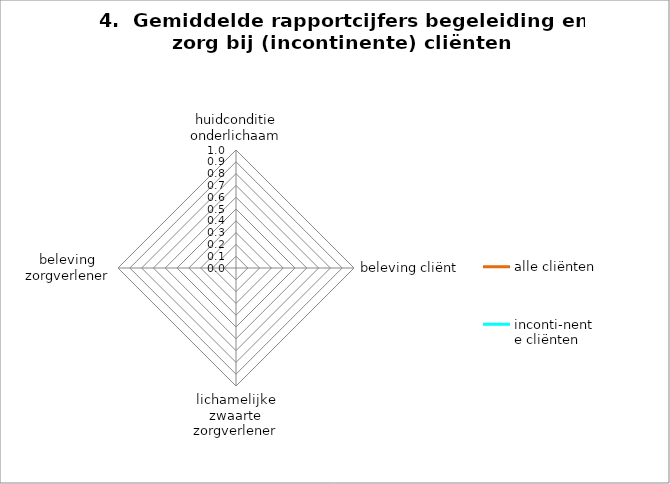
| Category | alle cliënten | inconti-nente cliënten |
|---|---|---|
| huidconditie onderlichaam | 0 | 0 |
| beleving cliënt | 0 | 0 |
| lichamelijke zwaarte zorgverlener | 0 | 0 |
| beleving zorgverlener | 0 | 0 |